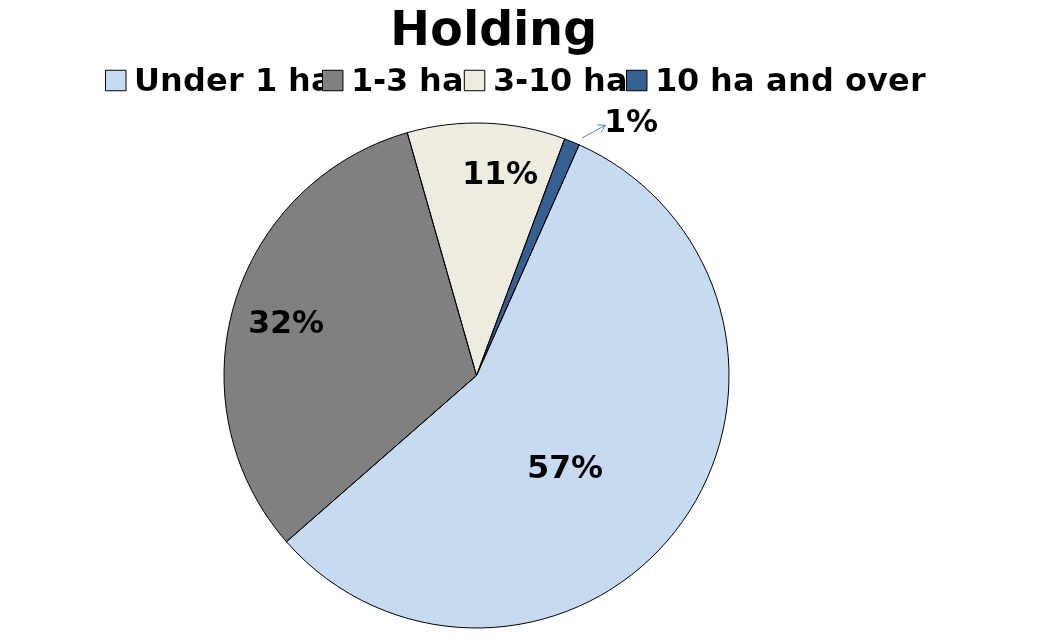
| Category | Holdings |
|---|---|
| Under 1 ha | 56.89 |
| 1-3 ha | 32.01 |
| 3-10 ha | 10.1 |
| 10 ha and over | 0.99 |